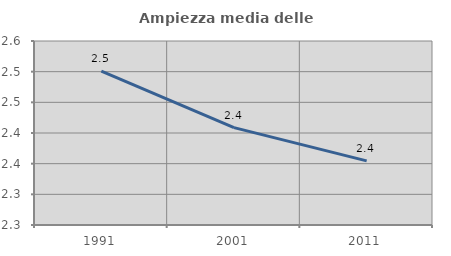
| Category | Ampiezza media delle famiglie |
|---|---|
| 1991.0 | 2.501 |
| 2001.0 | 2.409 |
| 2011.0 | 2.355 |